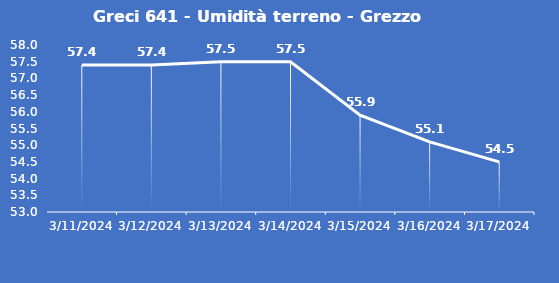
| Category | Greci 641 - Umidità terreno - Grezzo (%VWC) |
|---|---|
| 3/11/24 | 57.4 |
| 3/12/24 | 57.4 |
| 3/13/24 | 57.5 |
| 3/14/24 | 57.5 |
| 3/15/24 | 55.9 |
| 3/16/24 | 55.1 |
| 3/17/24 | 54.5 |